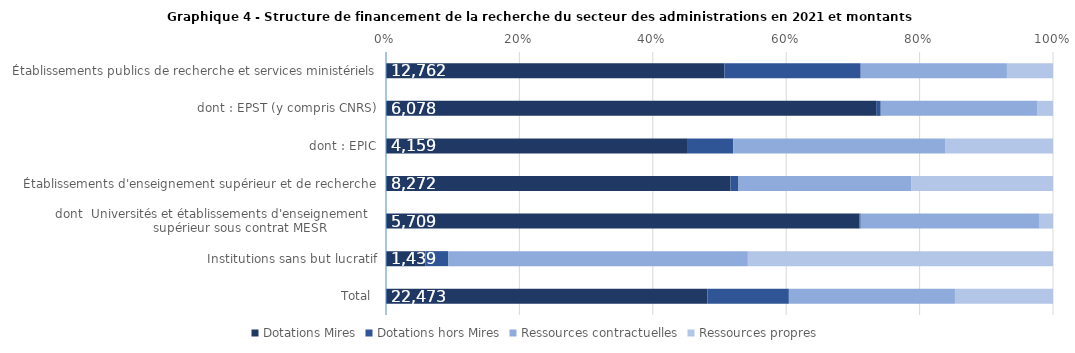
| Category | Dotations Mires | Dotations hors Mires | Ressources contractuelles | Ressources propres |
|---|---|---|---|---|
| Établissements publics de recherche et services ministériels | 50.7 | 20.4 | 21.9 | 6.9 |
| dont : EPST (y compris CNRS) | 73.5 | 0.6 | 23.5 | 2.3 |
| dont : EPIC | 45.3 | 6.8 | 31.8 | 16.2 |
| Établissements d'enseignement supérieur et de recherche | 51.7 | 1.2 | 25.9 | 21.3 |
| dont  Universités et établissements d'enseignement 
            supérieur sous contrat MESR | 70.9 | 0.2 | 26.7 | 2.1 |
| Institutions sans but lucratif | 5.9 | 3.4 | 44.9 | 45.7 |
| Total  | 48.2 | 12.2 | 24.9 | 14.7 |